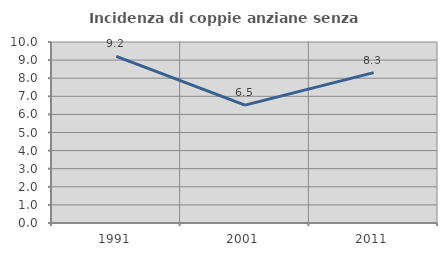
| Category | Incidenza di coppie anziane senza figli  |
|---|---|
| 1991.0 | 9.202 |
| 2001.0 | 6.51 |
| 2011.0 | 8.31 |